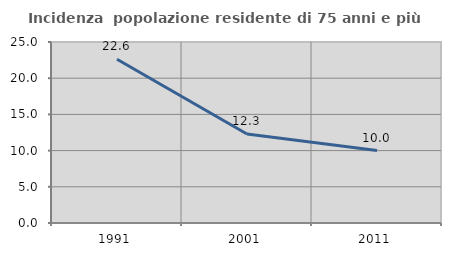
| Category | Incidenza  popolazione residente di 75 anni e più |
|---|---|
| 1991.0 | 22.609 |
| 2001.0 | 12.298 |
| 2011.0 | 10 |